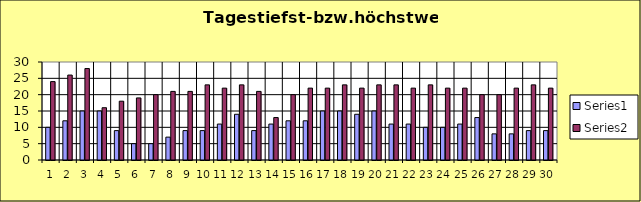
| Category | Series 0 | Series 1 |
|---|---|---|
| 0 | 10 | 24 |
| 1 | 12 | 26 |
| 2 | 15 | 28 |
| 3 | 15 | 16 |
| 4 | 9 | 18 |
| 5 | 5 | 19 |
| 6 | 5 | 20 |
| 7 | 7 | 21 |
| 8 | 9 | 21 |
| 9 | 9 | 23 |
| 10 | 11 | 22 |
| 11 | 14 | 23 |
| 12 | 9 | 21 |
| 13 | 11 | 13 |
| 14 | 12 | 20 |
| 15 | 12 | 22 |
| 16 | 15 | 22 |
| 17 | 15 | 23 |
| 18 | 14 | 22 |
| 19 | 15 | 23 |
| 20 | 11 | 23 |
| 21 | 11 | 22 |
| 22 | 10 | 23 |
| 23 | 10 | 22 |
| 24 | 11 | 22 |
| 25 | 13 | 20 |
| 26 | 8 | 20 |
| 27 | 8 | 22 |
| 28 | 9 | 23 |
| 29 | 9 | 22 |